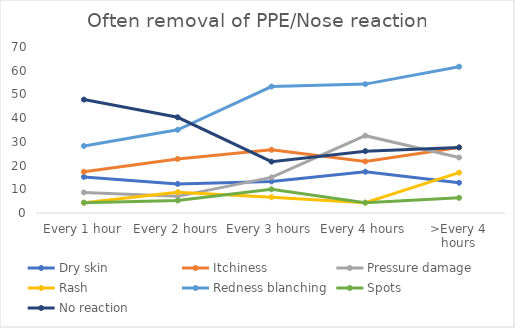
| Category | Dry skin | Itchiness | Pressure damage | Rash | Redness blanching | Spots | No reaction |
|---|---|---|---|---|---|---|---|
| Every 1 hour | 15.217 | 17.391 | 8.696 | 4.348 | 28.261 | 4.348 | 47.826 |
| Every 2 hours | 12.281 | 22.807 | 7.018 | 8.772 | 35.088 | 5.263 | 40.351 |
| Every 3 hours | 13.333 | 26.667 | 15 | 6.667 | 53.333 | 10 | 21.667 |
| Every 4 hours | 17.391 | 21.739 | 32.609 | 4.348 | 54.348 | 4.348 | 26.087 |
| >Every 4 hours | 12.766 | 27.66 | 23.404 | 17.021 | 61.702 | 6.383 | 27.66 |